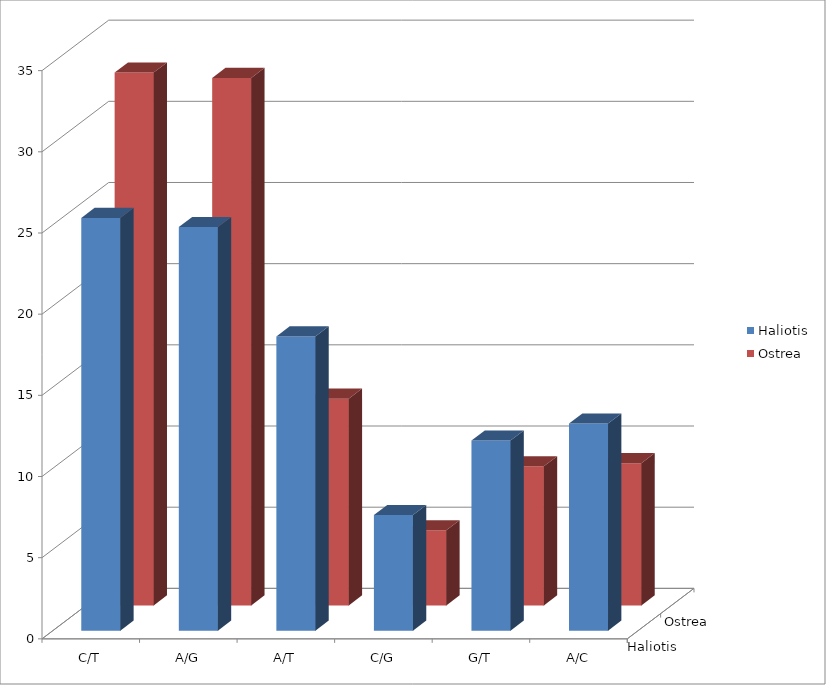
| Category | Haliotis | Ostrea |
|---|---|---|
| C/T | 25.425 | 32.819 |
| A/G | 24.858 | 32.491 |
| A/T | 18.122 | 12.732 |
| C/G | 7.124 | 4.625 |
| G/T | 11.714 | 8.569 |
| A/C | 12.757 | 8.764 |